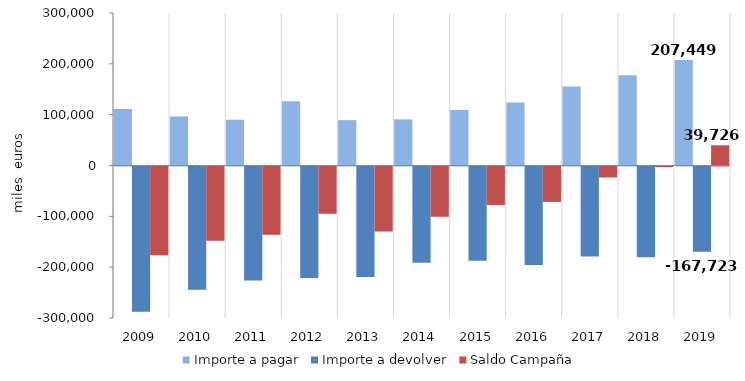
| Category | Importe a pagar | Importe a devolver | Saldo Campaña  |
|---|---|---|---|
| 2009.0 | 111037.303 | -285706.971 | -174669.668 |
| 2010.0 | 96576.254 | -242527.91 | -145951.656 |
| 2011.0 | 90014.588 | -224438.011 | -134423.423 |
| 2012.0 | 126538.987 | -219516.481 | -92977.494 |
| 2013.0 | 89274.189 | -217318.717 | -128044.528 |
| 2014.0 | 90756.111 | -189377.902 | -98621.791 |
| 2015.0 | 109397.392 | -185305.11 | -75907.718 |
| 2016.0 | 124091.908 | -193818.822 | -69726.914 |
| 2017.0 | 155476 | -177028 | -21552 |
| 2018.0 | 177646 | -178609 | -963 |
| 2019.0 | 207449 | -167723 | 39726 |